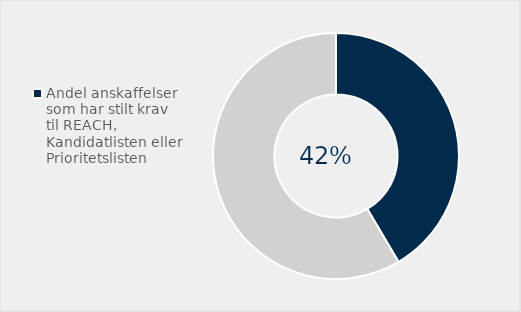
| Category | Series 0 |
|---|---|
| Andel anskaffelser som har stilt krav til REACH, Kandidatlisten eller Prioritetslisten | 0.415 |
| Ikke brukt  | 0.585 |